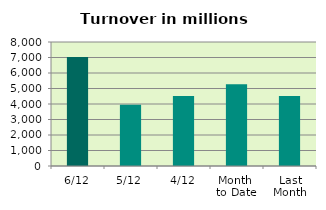
| Category | Series 0 |
|---|---|
| 6/12 | 7036.426 |
| 5/12 | 3953.066 |
| 4/12 | 4516.241 |
| Month 
to Date | 5276.072 |
| Last
Month | 4514.728 |